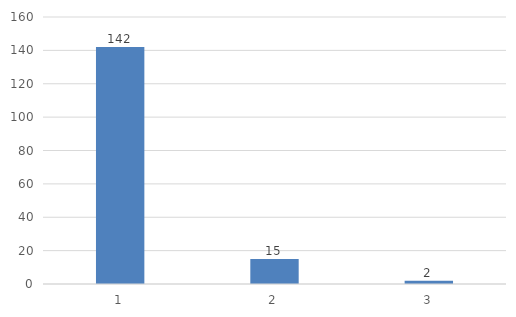
| Category | Series 0 |
|---|---|
| 0 | 142 |
| 1 | 15 |
| 2 | 2 |